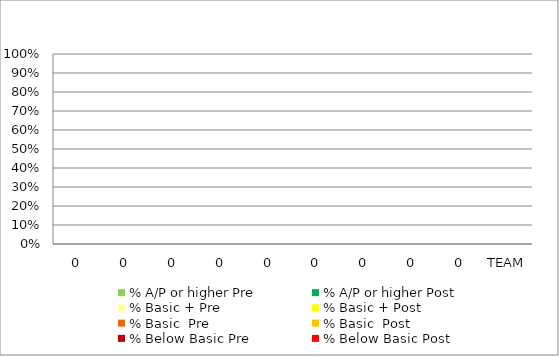
| Category | % A/P or higher Pre | % A/P or higher Post | % Basic + Pre | % Basic + Post | % Basic  Pre | % Basic  Post | % Below Basic Pre | % Below Basic Post |
|---|---|---|---|---|---|---|---|---|
| 0 | 0 | 0 | 0 | 0 | 0 | 0 | 0 | 0 |
| 0 | 0 | 0 | 0 | 0 | 0 | 0 | 0 | 0 |
| 0 | 0 | 0 | 0 | 0 | 0 | 0 | 0 | 0 |
| 0 | 0 | 0 | 0 | 0 | 0 | 0 | 0 | 0 |
| 0 | 0 | 0 | 0 | 0 | 0 | 0 | 0 | 0 |
| 0 | 0 | 0 | 0 | 0 | 0 | 0 | 0 | 0 |
| 0 | 0 | 0 | 0 | 0 | 0 | 0 | 0 | 0 |
| 0 | 0 | 0 | 0 | 0 | 0 | 0 | 0 | 0 |
| 0 | 0 | 0 | 0 | 0 | 0 | 0 | 0 | 0 |
| TEAM | 0 | 0 | 0 | 0 | 0 | 0 | 0 | 0 |